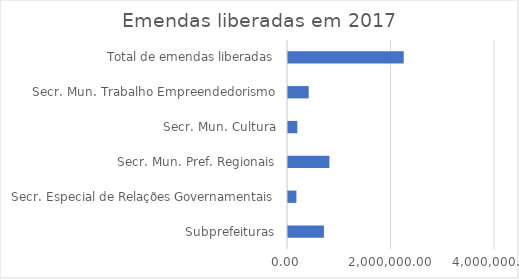
| Category | Series 0 |
|---|---|
| Subprefeituras | 694000 |
| Secr. Especial de Relações Governamentais | 161909 |
| Secr. Mun. Pref. Regionais | 800000 |
| Secr. Mun. Cultura | 180000 |
| Secr. Mun. Trabalho Empreendedorismo | 400000 |
| Total de emendas liberadas | 2235909 |